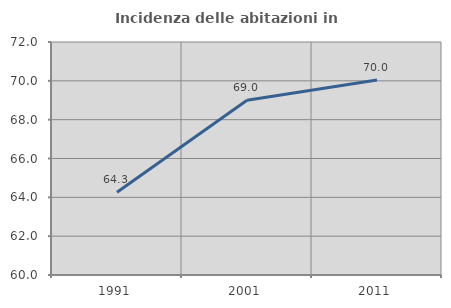
| Category | Incidenza delle abitazioni in proprietà  |
|---|---|
| 1991.0 | 64.264 |
| 2001.0 | 68.998 |
| 2011.0 | 70.046 |